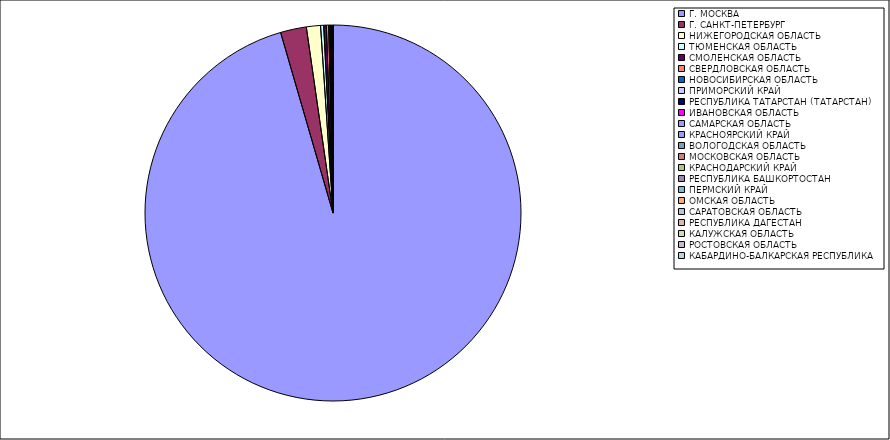
| Category | Оборот |
|---|---|
| Г. МОСКВА | 95.456 |
| Г. САНКТ-ПЕТЕРБУРГ | 2.226 |
| НИЖЕГОРОДСКАЯ ОБЛАСТЬ | 1.212 |
| ТЮМЕНСКАЯ ОБЛАСТЬ | 0.266 |
| СМОЛЕНСКАЯ ОБЛАСТЬ | 0.226 |
| СВЕРДЛОВСКАЯ ОБЛАСТЬ | 0.198 |
| НОВОСИБИРСКАЯ ОБЛАСТЬ | 0.094 |
| ПРИМОРСКИЙ КРАЙ | 0.065 |
| РЕСПУБЛИКА ТАТАРСТАН (ТАТАРСТАН) | 0.059 |
| ИВАНОВСКАЯ ОБЛАСТЬ | 0.022 |
| САМАРСКАЯ ОБЛАСТЬ | 0.02 |
| КРАСНОЯРСКИЙ КРАЙ | 0.017 |
| ВОЛОГОДСКАЯ ОБЛАСТЬ | 0.016 |
| МОСКОВСКАЯ ОБЛАСТЬ | 0.015 |
| КРАСНОДАРСКИЙ КРАЙ | 0.009 |
| РЕСПУБЛИКА БАШКОРТОСТАН | 0.008 |
| ПЕРМСКИЙ КРАЙ | 0.008 |
| ОМСКАЯ ОБЛАСТЬ | 0.007 |
| САРАТОВСКАЯ ОБЛАСТЬ | 0.007 |
| РЕСПУБЛИКА ДАГЕСТАН | 0.005 |
| КАЛУЖСКАЯ ОБЛАСТЬ | 0.005 |
| РОСТОВСКАЯ ОБЛАСТЬ | 0.005 |
| КАБАРДИНО-БАЛКАРСКАЯ РЕСПУБЛИКА | 0.005 |